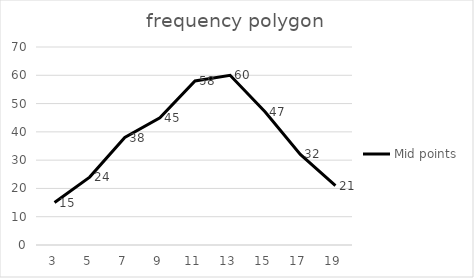
| Category | Mid points |
|---|---|
| 3.0 | 15 |
| 5.0 | 24 |
| 7.0 | 38 |
| 9.0 | 45 |
| 11.0 | 58 |
| 13.0 | 60 |
| 15.0 | 47 |
| 17.0 | 32 |
| 19.0 | 21 |